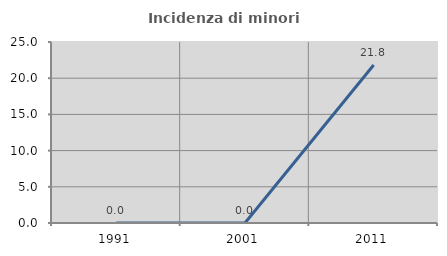
| Category | Incidenza di minori stranieri |
|---|---|
| 1991.0 | 0 |
| 2001.0 | 0 |
| 2011.0 | 21.818 |